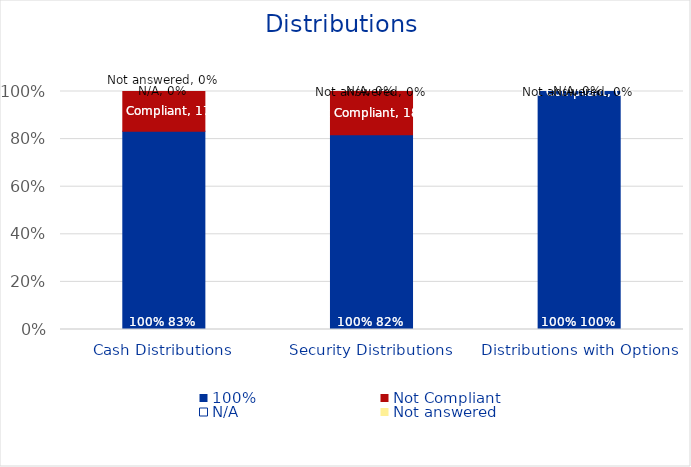
| Category | 100% | Not Compliant | N/A | Not answered |
|---|---|---|---|---|
| Cash Distributions | 0.833 | 0.167 | 0 | 0 |
| Security Distributions | 0.818 | 0.182 | 0 | 0 |
| Distributions with Options | 1 | 0 | 0 | 0 |